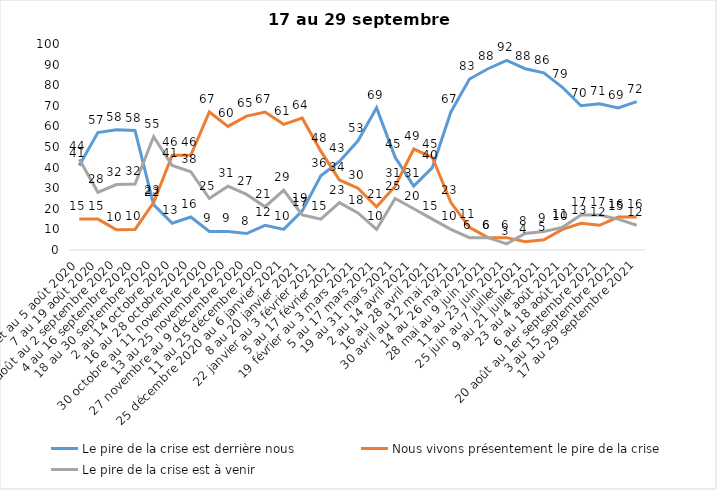
| Category | Le pire de la crise est derrière nous | Nous vivons présentement le pire de la crise | Le pire de la crise est à venir |
|---|---|---|---|
| 24 juillet au 5 août 2020 | 41 | 15 | 44 |
| 7 au 19 août 2020 | 57 | 15 | 28 |
| 21 août au 2 septembre 2020 | 58.39 | 9.84 | 31.77 |
| 4 au 16 septembre 2020 | 58 | 10 | 32 |
| 18 au 30 septembre 2020 | 22 | 23 | 55 |
| 2 au 14 octobre 2020 | 13 | 46 | 41 |
| 16 au 28 octobre 2020 | 16 | 46 | 38 |
| 30 octobre au 11 novembre 2020 | 9 | 67 | 25 |
| 13 au 25 novembre 2020 | 9 | 60 | 31 |
| 27 novembre au 9 décembre 2020 | 8 | 65 | 27 |
| 11 au 25 décembre 2020 | 12 | 67 | 21 |
| 25 décembre 2020 au 6 janvier 2021 | 10 | 61 | 29 |
| 8 au 20 janvier 2021 | 19 | 64 | 17 |
| 22 janvier au 3 février 2021 | 36 | 48 | 15 |
| 5 au 17 février 2021 | 43 | 34 | 23 |
| 19 février au 3 mars 2021 | 53 | 30 | 18 |
| 5 au 17 mars 2021 | 69 | 21 | 10 |
| 19 au 31 mars 2021 | 45 | 31 | 25 |
| 2 au 14 avril 2021 | 31 | 49 | 20 |
| 16 au 28 avril 2021 | 40 | 45 | 15 |
| 30 avril au 12 mai 2021 | 67 | 23 | 10 |
| 14 au 26 mai 2021 | 83 | 11 | 6 |
| 28 mai au 9 juin 2021 | 88 | 6 | 6 |
| 11 au 23 juin 2021 | 92 | 6 | 3 |
| 25 juin au 7 juillet 2021 | 88 | 4 | 8 |
| 9 au 21 juillet 2021 | 86 | 5 | 9 |
| 23 au 4 août 2021 | 79 | 10 | 11 |
| 6 au 18 août 2021 | 70 | 13 | 17 |
| 20 août au 1er septembre 2021 | 71 | 12 | 17 |
| 3 au 15 septembre 2021 | 69 | 16 | 15 |
| 17 au 29 septembre 2021 | 72 | 16 | 12 |